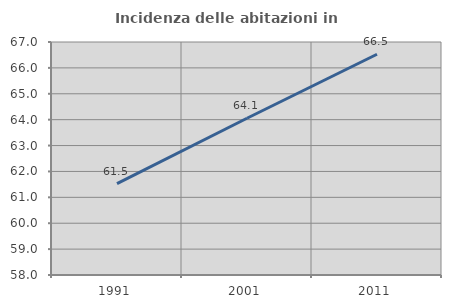
| Category | Incidenza delle abitazioni in proprietà  |
|---|---|
| 1991.0 | 61.526 |
| 2001.0 | 64.054 |
| 2011.0 | 66.527 |